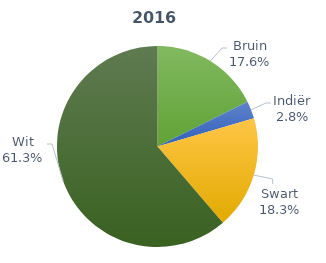
| Category | Series 0 |
|---|---|
| Bruin | 5443 |
| Indiër | 875 |
| Swart | 5629 |
| Wit | 18907 |